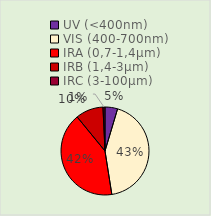
| Category | Series 0 |
|---|---|
| UV (<400nm) | 0.046 |
| VIS (400-700nm) | 0.429 |
| IRA (0,7-1,4µm) | 0.416 |
| IRB (1,4-3µm) | 0.102 |
| IRC (3-100µm) | 0.007 |